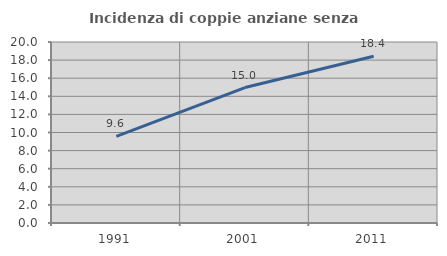
| Category | Incidenza di coppie anziane senza figli  |
|---|---|
| 1991.0 | 9.562 |
| 2001.0 | 14.965 |
| 2011.0 | 18.432 |